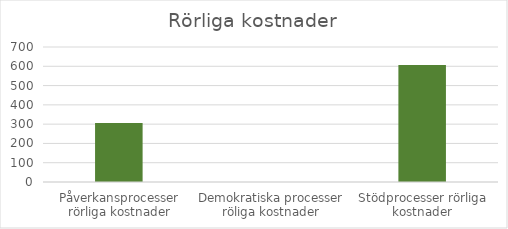
| Category | Series 4 |
|---|---|
| Påverkansprocesser rörliga kostnader | 306.5 |
| Demokratiska processer röliga kostnader | 0 |
| Stödprocesser rörliga kostnader | 607.2 |